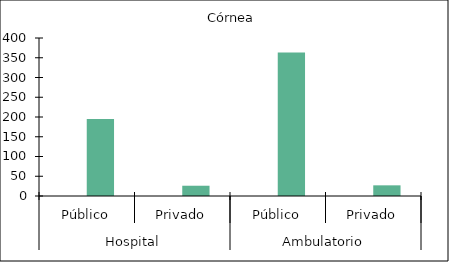
| Category |   |    Córnea |
|---|---|---|
| 0 | 0 | 195 |
| 1 | 0 | 26 |
| 2 | 0 | 363 |
| 3 | 0 | 27 |